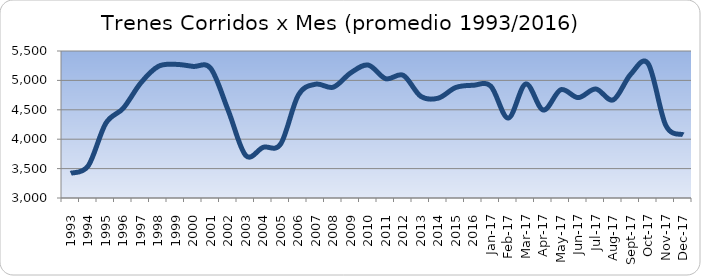
| Category | Series 0 |
|---|---|
| 1993.0 | 3420.25 |
| 1994.0 | 3547.25 |
| 1995.0 | 4268.917 |
| 1996.0 | 4526.417 |
| 1997.0 | 4956.25 |
| 1998.0 | 5238.083 |
| 1999.0 | 5272.75 |
| 2000.0 | 5237.75 |
| 2001.0 | 5203 |
| 2002.0 | 4487 |
| 2003.0 | 3723 |
| 2004.0 | 3862.167 |
| 2005.0 | 3921.083 |
| 2006.0 | 4747.25 |
| 2007.0 | 4935.583 |
| 2008.0 | 4884.5 |
| 2009.0 | 5128.583 |
| 2010.0 | 5260.333 |
| 2011.0 | 5028.417 |
| 2012.0 | 5086.25 |
| 2013.0 | 4729.583 |
| 2014.0 | 4697.917 |
| 2015.0 | 4879.417 |
| 2016.0 | 4916.833 |
| 42736.0 | 4903 |
| 42767.0 | 4359 |
| 42795.0 | 4939 |
| 42826.0 | 4496 |
| 42856.0 | 4841 |
| 42887.0 | 4707 |
| 42917.0 | 4854 |
| 42948.0 | 4669 |
| 42979.0 | 5105 |
| 43009.0 | 5282 |
| 43040.0 | 4237 |
| 43070.0 | 4075 |